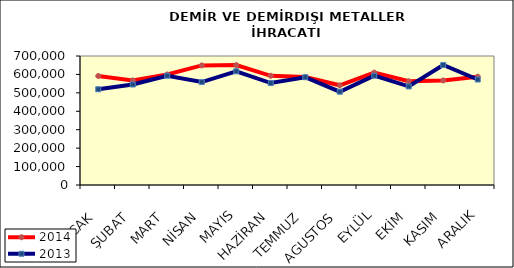
| Category | 2014 | 2013 |
|---|---|---|
| OCAK | 591731.413 | 519503.439 |
| ŞUBAT | 567771.303 | 545252.584 |
| MART | 599491.463 | 593049.041 |
| NİSAN | 648813.58 | 558709.395 |
| MAYIS | 650771.332 | 617223.017 |
| HAZİRAN | 592608.257 | 553130.973 |
| TEMMUZ | 585665.233 | 584798.784 |
| AGUSTOS | 540991.456 | 506318.264 |
| EYLÜL | 609880.293 | 593124.017 |
| EKİM | 562949.458 | 534887.564 |
| KASIM | 567319.347 | 651406.503 |
| ARALIK | 587851.506 | 572435.899 |